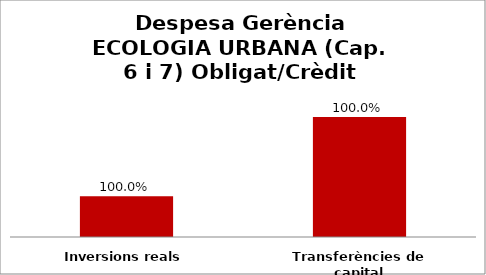
| Category | Series 0 |
|---|---|
| Inversions reals | 1 |
| Transferències de capital | 1 |